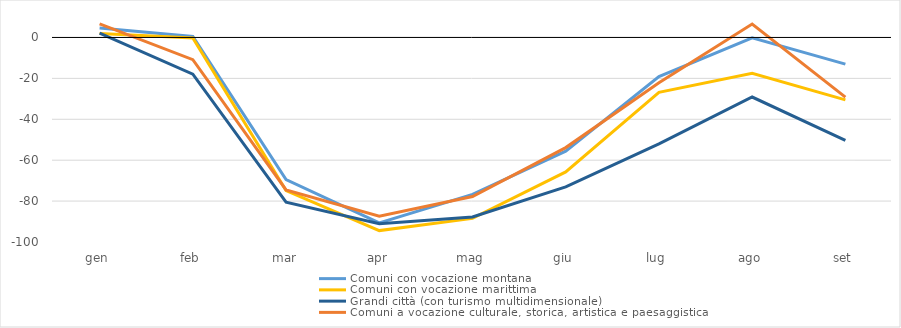
| Category | Comuni con vocazione montana | Comuni con vocazione marittima | Grandi città (con turismo multidimensionale) | Comuni a vocazione culturale, storica, artistica e paesaggistica |
|---|---|---|---|---|
| gen | 4.644 | 1.932 | 2.067 | 6.597 |
| feb | 0.508 | -0.228 | -17.982 | -10.875 |
| mar | -69.458 | -74.852 | -80.501 | -74.54 |
| apr | -90.622 | -94.423 | -91.084 | -87.404 |
| mag | -76.717 | -88.448 | -87.756 | -77.764 |
| giu | -55.573 | -65.726 | -73.038 | -53.852 |
| lug | -19.084 | -26.832 | -52.056 | -22.172 |
| ago | -0.214 | -17.488 | -29.128 | 6.532 |
| set | -13.043 | -30.497 | -50.337 | -29.184 |